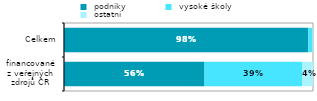
| Category |  podniky |  vysoké školy |  ostatní  |
|---|---|---|---|
| financované
z veřejných
zdrojů ČR | 0.564 | 0.391 | 0.044 |
| Celkem | 0.981 | 0.017 | 0.002 |